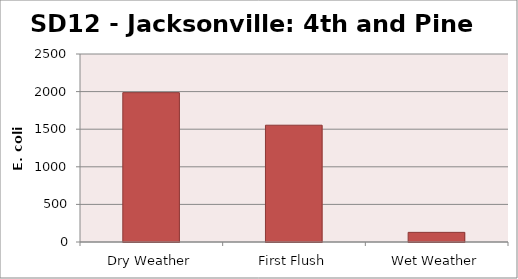
| Category | E. coli MPN |
|---|---|
| Dry Weather | 1986.3 |
| First Flush | 1553.1 |
| Wet Weather | 128.1 |